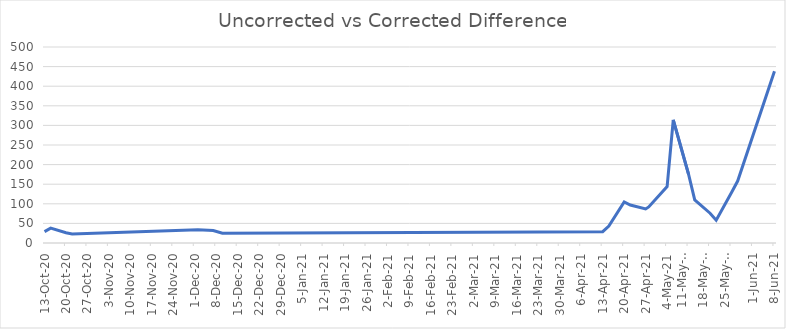
| Category | Difference |
|---|---|
| 2020-10-13 | 29 |
| 2020-10-15 | 38 |
| 2020-10-20 | 26 |
| 2020-10-22 | 23 |
| 2020-12-02 | 34 |
| 2020-12-07 | 32 |
| 2020-12-10 | 25 |
| 2021-04-13 | 29 |
| 2021-04-15 | 43 |
| 2021-04-20 | 105 |
| 2021-04-22 | 97 |
| 2021-04-27 | 87 |
| 2021-04-28 | 92 |
| 2021-05-04 | 144 |
| 2021-05-06 | 314 |
| 2021-05-11 | 175 |
| 2021-05-13 | 110 |
| 2021-05-18 | 76 |
| 2021-05-20 | 58 |
| 2021-05-25 | 129 |
| 2021-05-27 | 158 |
| 2021-06-08 | 438 |